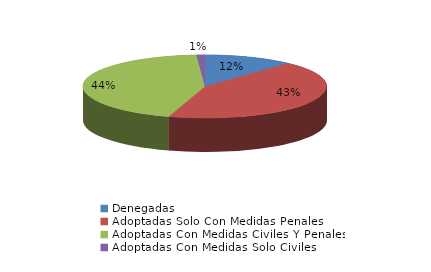
| Category | Series 0 |
|---|---|
| Denegadas | 21 |
| Adoptadas Solo Con Medidas Penales | 76 |
| Adoptadas Con Medidas Civiles Y Penales | 78 |
| Adoptadas Con Medidas Solo Civiles | 2 |